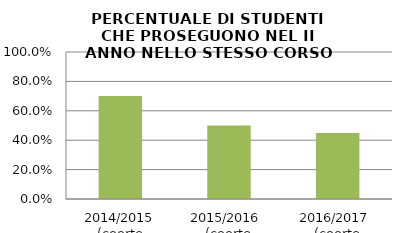
| Category | 2014/2015 (coorte 2013/14) 2015/2016  (coorte 2014/15) 2016/2017  (coorte 2015/16) |
|---|---|
| 2014/2015 (coorte 2013/14) | 0.7 |
| 2015/2016  (coorte 2014/15) | 0.5 |
| 2016/2017  (coorte 2015/16) | 0.448 |